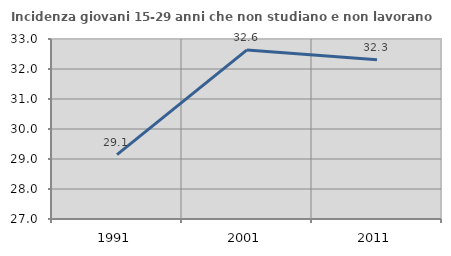
| Category | Incidenza giovani 15-29 anni che non studiano e non lavorano  |
|---|---|
| 1991.0 | 29.145 |
| 2001.0 | 32.637 |
| 2011.0 | 32.305 |